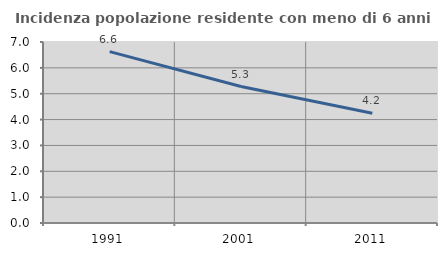
| Category | Incidenza popolazione residente con meno di 6 anni |
|---|---|
| 1991.0 | 6.627 |
| 2001.0 | 5.277 |
| 2011.0 | 4.241 |